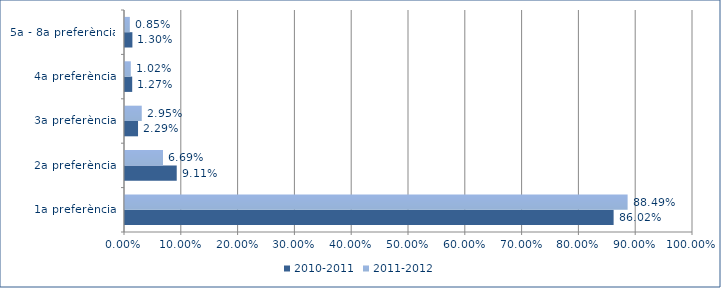
| Category | 2010-2011 | 2011-2012 |
|---|---|---|
| 1a preferència | 0.86 | 0.885 |
| 2a preferència | 0.091 | 0.067 |
| 3a preferència | 0.023 | 0.03 |
| 4a preferència | 0.013 | 0.01 |
| 5a - 8a preferència | 0.013 | 0.008 |